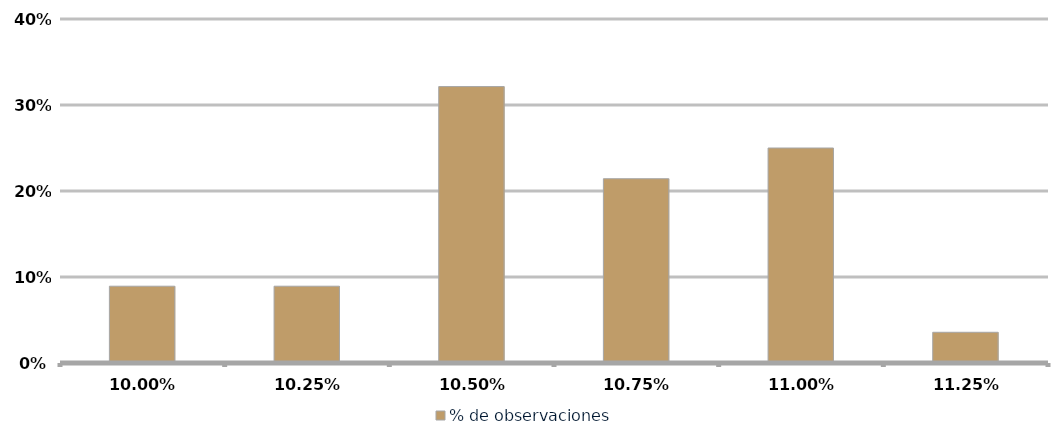
| Category | % de observaciones  |
|---|---|
| 0.09999999999999999 | 0.089 |
| 0.1025 | 0.089 |
| 0.105 | 0.321 |
| 0.1075 | 0.214 |
| 0.11 | 0.25 |
| 0.1125 | 0.036 |